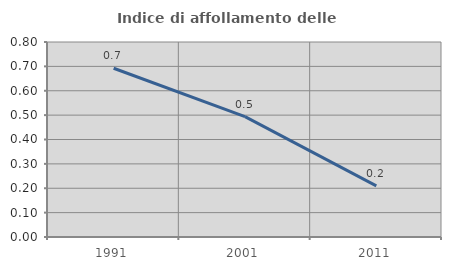
| Category | Indice di affollamento delle abitazioni  |
|---|---|
| 1991.0 | 0.692 |
| 2001.0 | 0.494 |
| 2011.0 | 0.21 |